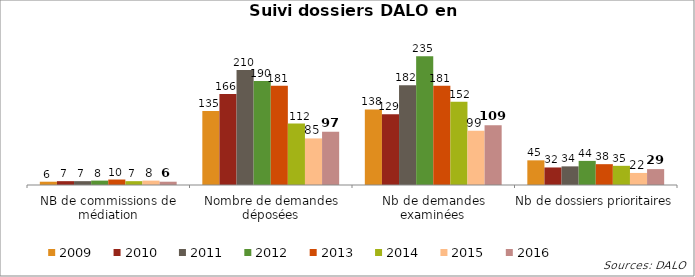
| Category | 2009 | 2010 | 2011 | 2012 | 2013 | 2014 | 2015 | 2016 |
|---|---|---|---|---|---|---|---|---|
| NB de commissions de médiation | 6 | 7 | 7 | 8 | 10 | 7 | 8 | 6 |
| Nombre de demandes déposées | 135 | 166 | 210 | 190 | 181 | 112 | 85 | 97 |
| Nb de demandes examinées | 138 | 129 | 182 | 235 | 181 | 152 | 99 | 109 |
| Nb de dossiers prioritaires | 45 | 32 | 34 | 44 | 38 | 35 | 22 | 29 |